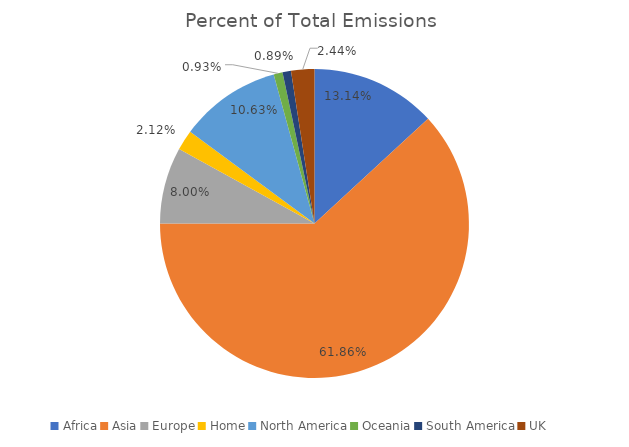
| Category | Percent of Total Emissions  |
|---|---|
| Africa | 0.131 |
| Asia | 0.619 |
| Europe | 0.08 |
| Home | 0.021 |
| North America | 0.106 |
| Oceania | 0.009 |
| South America | 0.009 |
| UK | 0.024 |